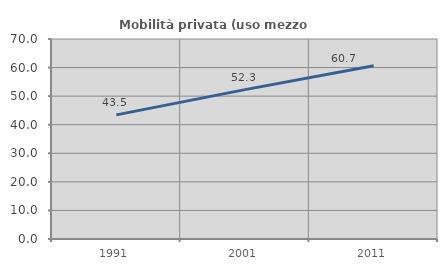
| Category | Mobilità privata (uso mezzo privato) |
|---|---|
| 1991.0 | 43.451 |
| 2001.0 | 52.279 |
| 2011.0 | 60.656 |